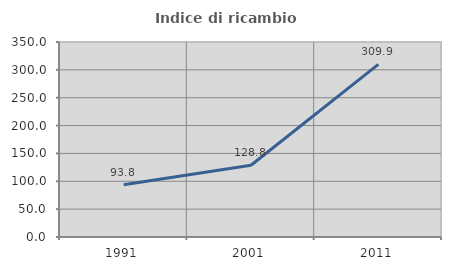
| Category | Indice di ricambio occupazionale  |
|---|---|
| 1991.0 | 93.75 |
| 2001.0 | 128.78 |
| 2011.0 | 309.945 |